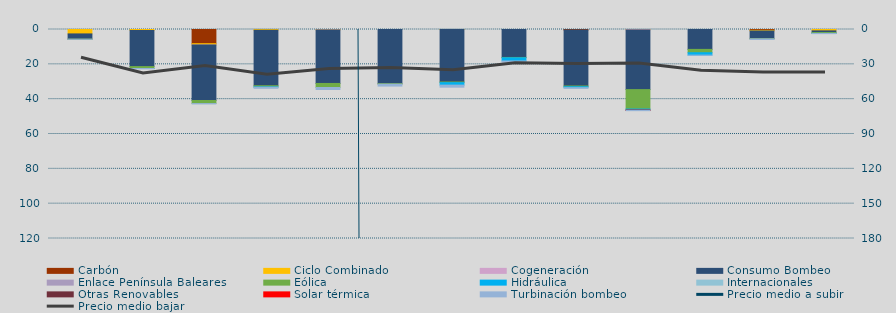
| Category | Carbón | Ciclo Combinado | Cogeneración | Consumo Bombeo | Enlace Península Baleares | Eólica | Hidráulica | Internacionales | Otras Renovables | Solar térmica | Turbinación bombeo |
|---|---|---|---|---|---|---|---|---|---|---|---|
| 0 | 0 | 2533.1 | 0 | 2991.4 |  | 42.6 | 0 |  | 0 | 0 | 65 |
| 1 | 0 | 555.8 | 0 | 20748.5 |  | 1071 | 8.2 |  | 0 | 0 | 183.2 |
| 2 | 8149.5 | 754.8 | 3.5 | 31856.3 |  | 1760.6 | 0 |  | 0 | 0 | 177.8 |
| 3 | 0 | 458.3 | 0 | 31829.7 |  | 671.7 | 189.5 |  | 0 | 0 | 613.5 |
| 4 | 0 | 223.8 | 2.4 | 30752.2 |  | 2324.3 | 0 |  | 0 | 0 | 1135.9 |
| 5 | 0 | 0 | 0 | 31097.5 |  | 268.5 | 0 |  | 0 | 0 | 1121.8 |
| 6 | 0 | 20 | 0 | 30123.6 |  | 373.8 | 1416.6 |  | 0 | 0 | 1190.9 |
| 7 | 0 | 0 | 0 | 16053.6 |  | 185.3 | 1837.6 |  | 0 | 0 | 606.6 |
| 8 | 350.4 | 0 | 0 | 32084.5 |  | 425.7 | 531.2 |  | 0 | 0 | 413.1 |
| 9 | 0 | 90 | 154.4 | 34261.7 |  | 11163.7 | 589.5 |  | 122.2 | 44.1 | 171.5 |
| 10 | 0 | 0 | 0 | 11426.8 |  | 1911.2 | 1375.3 |  | 0 | 0 | 67.5 |
| 11 | 482 | 368.5 | 0 | 4415 |  | 113.2 | 0 |  | 0 | 0 | 368.4 |
| 12 | 0 | 796.6 | 0 | 914.2 |  | 550.1 | 8.9 |  | 0 | 0 | 104 |